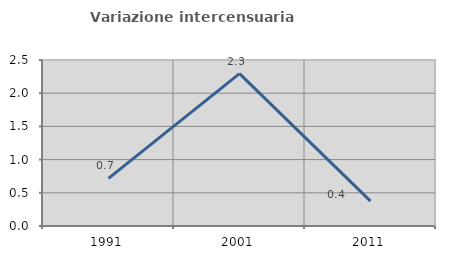
| Category | Variazione intercensuaria annua |
|---|---|
| 1991.0 | 0.717 |
| 2001.0 | 2.294 |
| 2011.0 | 0.375 |